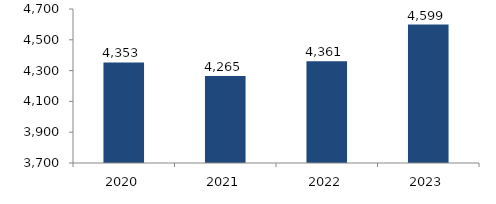
| Category | Bogotá |
|---|---|
| 2020.0 | 4352.992 |
| 2021.0 | 4264.662 |
| 2022.0 | 4361.247 |
| 2023.0 | 4599.07 |